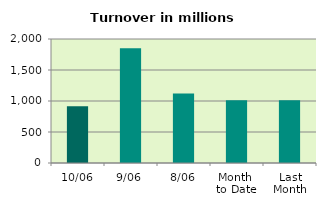
| Category | Series 0 |
|---|---|
| 10/06 | 916.373 |
| 9/06 | 1852.732 |
| 8/06 | 1122.279 |
| Month 
to Date | 1014.018 |
| Last
Month | 1012.592 |